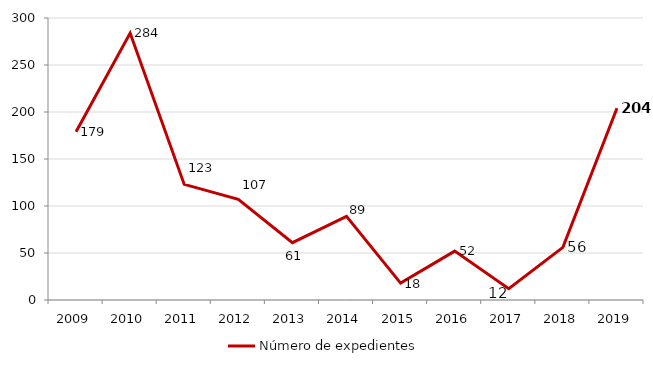
| Category | Número de expedientes |
|---|---|
| 2009.0 | 179 |
| 2010.0 | 284 |
| 2011.0 | 123 |
| 2012.0 | 107 |
| 2013.0 | 61 |
| 2014.0 | 89 |
| 2015.0 | 18 |
| 2016.0 | 52 |
| 2017.0 | 12 |
| 2018.0 | 56 |
| 2019.0 | 204 |